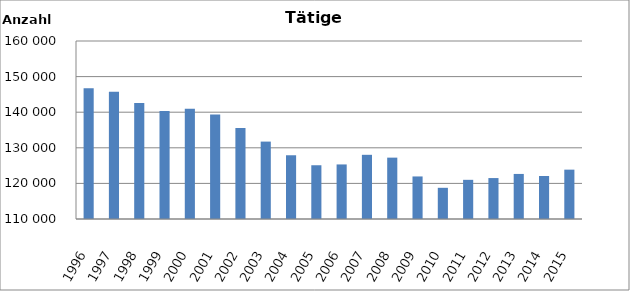
| Category | Series 0 |
|---|---|
| 1996.0 | 146742 |
| 1997.0 | 145717 |
| 1998.0 | 142598 |
| 1999.0 | 140319 |
| 2000.0 | 140983 |
| 2001.0 | 139341 |
| 2002.0 | 135596 |
| 2003.0 | 131743 |
| 2004.0 | 127904 |
| 2005.0 | 125099 |
| 2006.0 | 125327 |
| 2007.0 | 128030 |
| 2008.0 | 127238 |
| 2009.0 | 121954 |
| 2010.0 | 118762 |
| 2011.0 | 121003 |
| 2012.0 | 121500 |
| 2013.0 | 122658 |
| 2014.0 | 122086 |
| 2015.0 | 123861 |